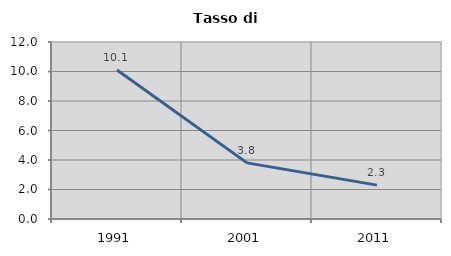
| Category | Tasso di disoccupazione   |
|---|---|
| 1991.0 | 10.106 |
| 2001.0 | 3.805 |
| 2011.0 | 2.298 |